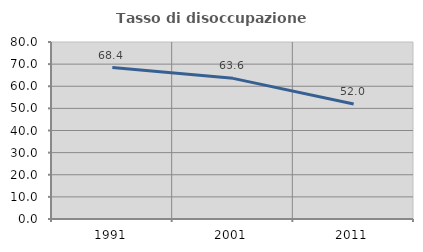
| Category | Tasso di disoccupazione giovanile  |
|---|---|
| 1991.0 | 68.421 |
| 2001.0 | 63.564 |
| 2011.0 | 52.01 |